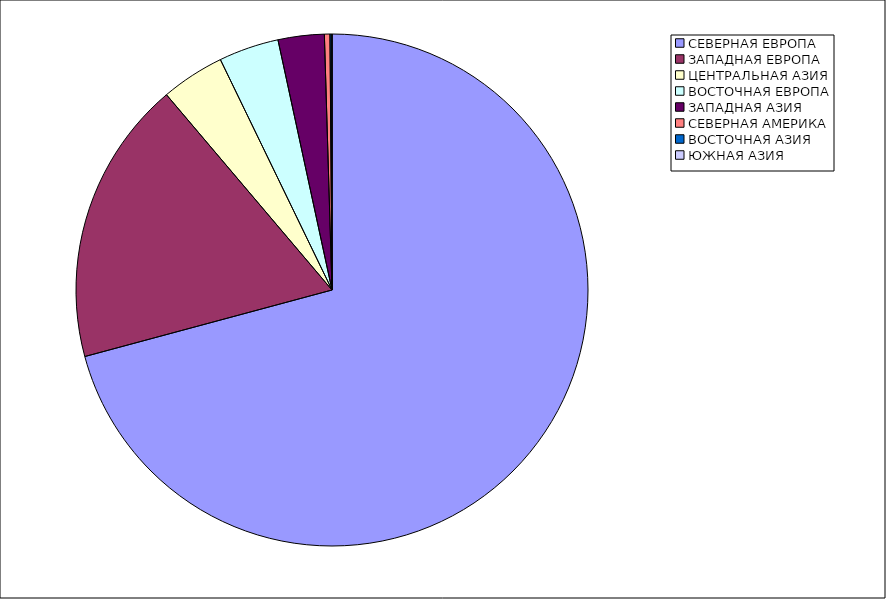
| Category | Оборот |
|---|---|
| СЕВЕРНАЯ ЕВРОПА | 70.814 |
| ЗАПАДНАЯ ЕВРОПА | 17.995 |
| ЦЕНТРАЛЬНАЯ АЗИЯ | 4.011 |
| ВОСТОЧНАЯ ЕВРОПА | 3.793 |
| ЗАПАДНАЯ АЗИЯ | 2.911 |
| СЕВЕРНАЯ АМЕРИКА | 0.35 |
| ВОСТОЧНАЯ АЗИЯ | 0.126 |
| ЮЖНАЯ АЗИЯ | 0 |